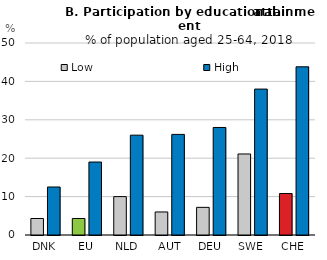
| Category | Low | High |
|---|---|---|
| DNK | 4.3 | 12.5 |
| EU | 4.3 | 19 |
| NLD | 10 | 26 |
| AUT | 6 | 26.2 |
| DEU | 7.2 | 28 |
| SWE | 21.1 | 38 |
| CHE | 10.8 | 43.8 |